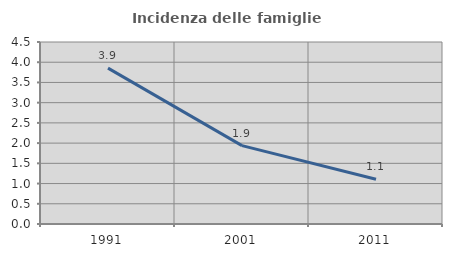
| Category | Incidenza delle famiglie numerose |
|---|---|
| 1991.0 | 3.854 |
| 2001.0 | 1.938 |
| 2011.0 | 1.107 |